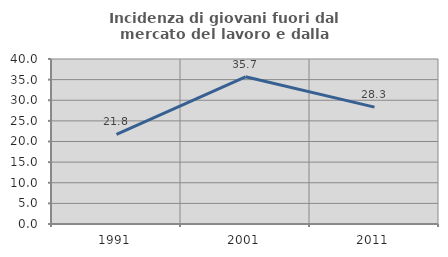
| Category | Incidenza di giovani fuori dal mercato del lavoro e dalla formazione  |
|---|---|
| 1991.0 | 21.751 |
| 2001.0 | 35.678 |
| 2011.0 | 28.335 |